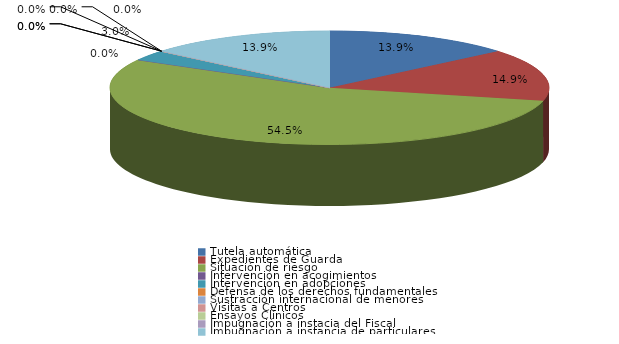
| Category | Series 0 |
|---|---|
| Tutela automática | 14 |
| Expedientes de Guarda | 15 |
| Situación de riesgo | 55 |
| Intervención en acogimientos | 0 |
| Intervención en adopciones | 3 |
| Defensa de los derechos fundamentales | 0 |
| Sustracción internacional de menores | 0 |
| Visitas a Centros | 0 |
| Ensayos Clínicos | 0 |
| Impugnación a instacia del Fiscal | 0 |
| Impugnación a instancia de particulares | 14 |